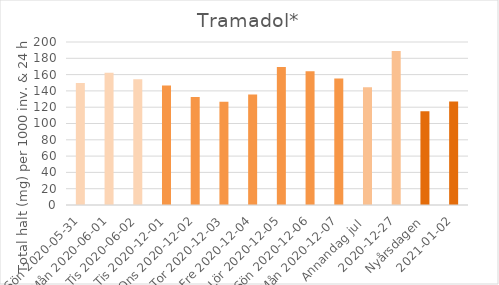
| Category | Tramadol* |
|---|---|
| Sön 2020-05-31 | 149.8 |
| Mån 2020-06-01 | 162.4 |
|  Tis 2020-06-02 | 154.3 |
| Tis 2020-12-01 | 146.6 |
| Ons 2020-12-02 | 132.6 |
| Tor 2020-12-03 | 126.7 |
| Fre 2020-12-04 | 135.5 |
| Lör 2020-12-05 | 169.2 |
| Sön 2020-12-06 | 164.1 |
| Mån 2020-12-07 | 155.2 |
| Annandag jul  | 144.6 |
| 2020-12-27 | 188.9 |
| Nyårsdagen | 115 |
| 2021-01-02 | 127 |